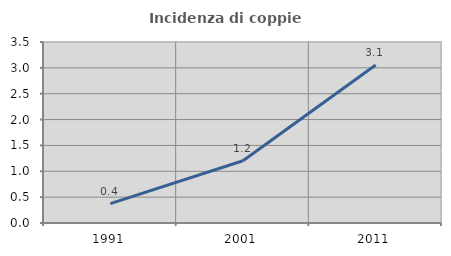
| Category | Incidenza di coppie miste |
|---|---|
| 1991.0 | 0.375 |
| 2001.0 | 1.204 |
| 2011.0 | 3.054 |